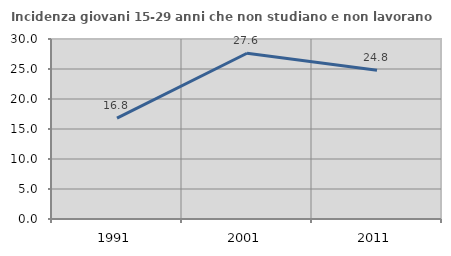
| Category | Incidenza giovani 15-29 anni che non studiano e non lavorano  |
|---|---|
| 1991.0 | 16.81 |
| 2001.0 | 27.627 |
| 2011.0 | 24.807 |